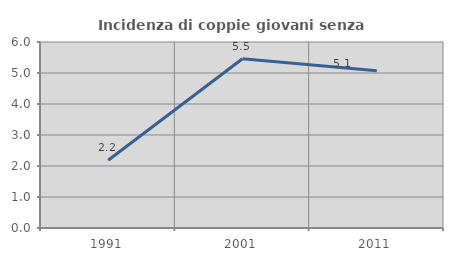
| Category | Incidenza di coppie giovani senza figli |
|---|---|
| 1991.0 | 2.188 |
| 2001.0 | 5.46 |
| 2011.0 | 5.076 |